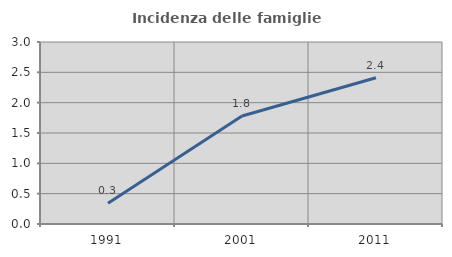
| Category | Incidenza delle famiglie numerose |
|---|---|
| 1991.0 | 0.342 |
| 2001.0 | 1.779 |
| 2011.0 | 2.41 |